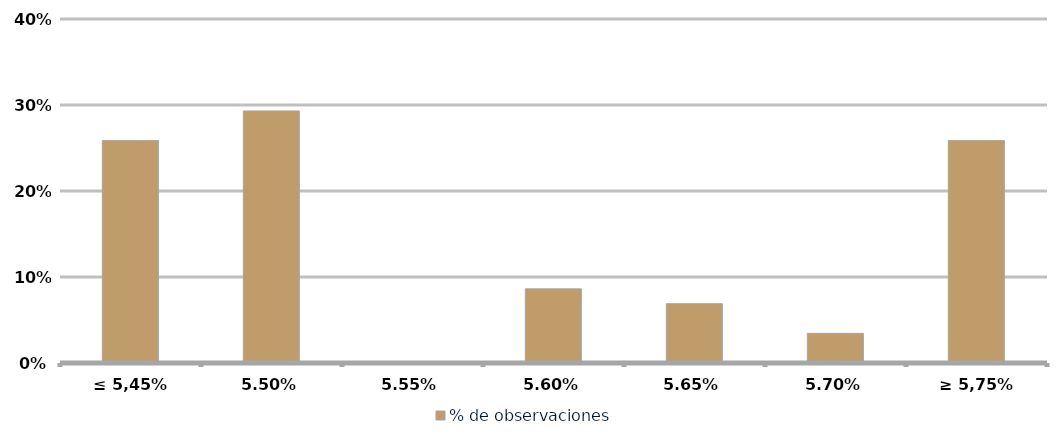
| Category | % de observaciones  |
|---|---|
| ≤ 5,45% | 0.259 |
| 5,50% | 0.293 |
| 5,55% | 0 |
| 5,60% | 0.086 |
| 5,65% | 0.069 |
| 5,70% | 0.034 |
| ≥ 5,75% | 0.259 |